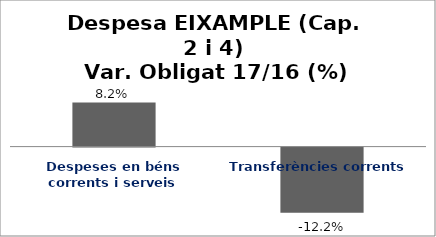
| Category | Series 0 |
|---|---|
| Despeses en béns corrents i serveis | 0.082 |
| Transferències corrents | -0.122 |